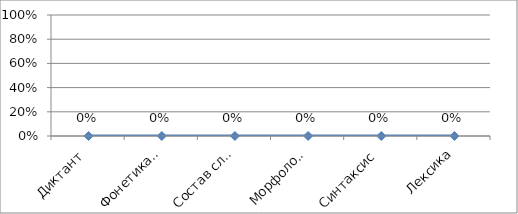
| Category | Series 0 |
|---|---|
| Диктант | 0 |
| Фонетика и графика | 0 |
| Состав слова | 0 |
| Морфология | 0 |
| Синтаксис | 0 |
| Лексика | 0 |